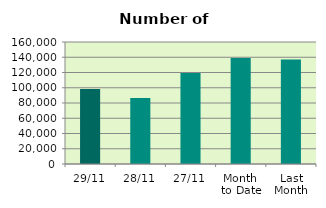
| Category | Series 0 |
|---|---|
| 29/11 | 98338 |
| 28/11 | 86576 |
| 27/11 | 119252 |
| Month 
to Date | 138953.619 |
| Last
Month | 137122.087 |